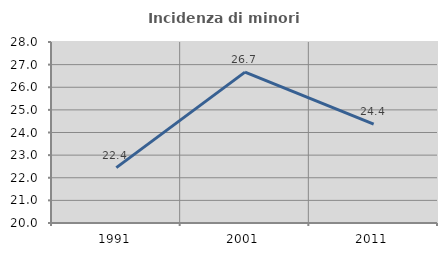
| Category | Incidenza di minori stranieri |
|---|---|
| 1991.0 | 22.449 |
| 2001.0 | 26.667 |
| 2011.0 | 24.373 |